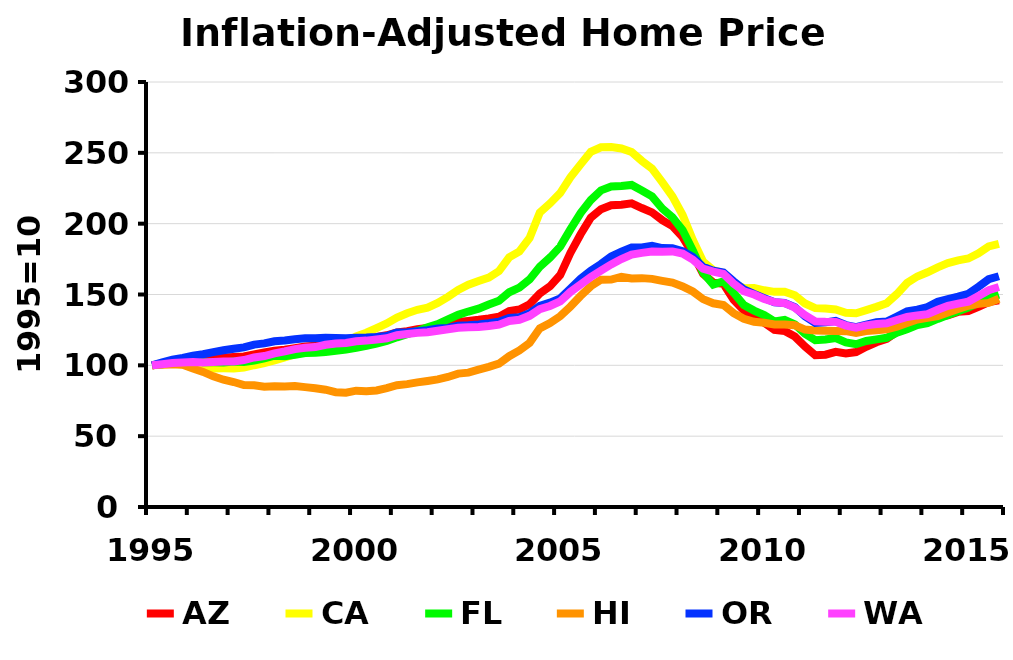
| Category | AZ | CA | FL | HI | OR | WA |
|---|---|---|---|---|---|---|
| 1995.0 | 100 | 100 | 100 | 100 | 100 | 100 |
| 1995.0 | 101.342 | 100.484 | 100.801 | 100.586 | 102.035 | 100.753 |
| 1995.0 | 102.774 | 101.14 | 102.287 | 100.735 | 104.061 | 101.647 |
| 1995.0 | 103.462 | 100.509 | 102.594 | 100.382 | 105.261 | 101.917 |
| 1996.0 | 104.591 | 99.964 | 103.133 | 97.746 | 106.752 | 102.33 |
| 1996.0 | 104.351 | 98.319 | 102.182 | 95.379 | 107.859 | 102.015 |
| 1996.0 | 105.069 | 97.852 | 102.118 | 92.247 | 109.298 | 102.302 |
| 1996.0 | 105.575 | 97.872 | 102.088 | 89.863 | 110.601 | 102.624 |
| 1997.0 | 105.873 | 97.774 | 102.773 | 88.228 | 111.661 | 102.72 |
| 1997.0 | 106.309 | 98.473 | 102.392 | 86.027 | 112.657 | 103.723 |
| 1997.0 | 107.769 | 100.085 | 103.425 | 85.91 | 114.612 | 105.556 |
| 1997.0 | 109.027 | 101.497 | 104.864 | 84.834 | 115.466 | 106.545 |
| 1998.0 | 110.241 | 103.502 | 106.788 | 85.201 | 116.987 | 108.415 |
| 1998.0 | 111.101 | 105.522 | 106.461 | 85.008 | 117.577 | 109.817 |
| 1998.0 | 112.168 | 107.878 | 107.386 | 85.377 | 118.362 | 111.436 |
| 1998.0 | 113.227 | 109.602 | 108.688 | 84.611 | 119.114 | 112.386 |
| 1999.0 | 113.869 | 110.745 | 108.852 | 83.807 | 119.097 | 112.902 |
| 1999.0 | 114.939 | 112.272 | 109.318 | 82.79 | 119.394 | 114.506 |
| 1999.0 | 116.211 | 114.435 | 110.22 | 81.068 | 119.315 | 115.398 |
| 1999.0 | 116.787 | 116.317 | 111.064 | 80.68 | 119.193 | 115.785 |
| 2000.0 | 118.5 | 120.444 | 112.387 | 82.131 | 119.509 | 116.95 |
| 2000.0 | 119.201 | 123.018 | 113.719 | 81.747 | 119.617 | 117.46 |
| 2000.0 | 120.003 | 126.318 | 115.368 | 82.263 | 119.951 | 118.302 |
| 2000.0 | 121.205 | 129.521 | 117.179 | 83.861 | 120.649 | 119.147 |
| 2001.0 | 123.16 | 133.659 | 119.775 | 85.98 | 123.139 | 121.301 |
| 2001.0 | 124.174 | 136.77 | 121.936 | 86.727 | 123.411 | 122.073 |
| 2001.0 | 125.578 | 139.203 | 124.309 | 87.956 | 124.117 | 122.907 |
| 2001.0 | 126.417 | 140.726 | 126.933 | 88.974 | 124.825 | 123.356 |
| 2002.0 | 127.761 | 144.03 | 129.084 | 90.086 | 126.015 | 124.462 |
| 2002.0 | 128.924 | 148.368 | 132.476 | 91.797 | 126.422 | 125.494 |
| 2002.0 | 130.591 | 153.25 | 135.627 | 94.176 | 128.009 | 126.494 |
| 2002.0 | 131.371 | 156.871 | 137.978 | 94.859 | 128.353 | 126.882 |
| 2003.0 | 132.135 | 159.512 | 140.027 | 96.935 | 128.884 | 127.135 |
| 2003.0 | 133.081 | 161.972 | 142.939 | 98.935 | 129.652 | 127.827 |
| 2003.0 | 134.362 | 166.503 | 145.557 | 101.209 | 130.774 | 128.687 |
| 2003.0 | 138.232 | 176.273 | 151.588 | 106.465 | 133.506 | 131.339 |
| 2004.0 | 139.43 | 180.34 | 154.821 | 110.533 | 133.973 | 132.149 |
| 2004.0 | 143.112 | 189.921 | 160.606 | 115.864 | 136.799 | 134.941 |
| 2004.0 | 150.727 | 207.881 | 169.588 | 126.125 | 141.973 | 139.702 |
| 2004.0 | 155.776 | 214.269 | 176.047 | 129.848 | 144.268 | 141.911 |
| 2005.0 | 163.728 | 221.57 | 183.802 | 134.684 | 147.295 | 145.151 |
| 2005.0 | 179.348 | 232.729 | 195.961 | 141.476 | 154.035 | 151.792 |
| 2005.0 | 192.532 | 241.866 | 207.5 | 148.985 | 161.046 | 157.022 |
| 2005.0 | 204.198 | 250.736 | 216.661 | 155.833 | 166.849 | 162.392 |
| 2006.0 | 210.251 | 253.903 | 223.531 | 160.461 | 171.504 | 166.842 |
| 2006.0 | 212.977 | 254.098 | 226.295 | 160.555 | 176.947 | 171.275 |
| 2006.0 | 213.403 | 253.083 | 226.581 | 162.411 | 180.316 | 175.055 |
| 2006.0 | 214.309 | 250.63 | 227.351 | 161.369 | 183.19 | 178.15 |
| 2007.0 | 211.026 | 244.353 | 223.442 | 161.553 | 183.179 | 179.405 |
| 2007.0 | 207.939 | 238.85 | 219.3 | 161.033 | 184.289 | 180.33 |
| 2007.0 | 202.537 | 229.356 | 210.675 | 159.655 | 182.738 | 180.179 |
| 2007.0 | 198.259 | 219.278 | 204.56 | 158.407 | 182.657 | 180.409 |
| 2008.0 | 190.498 | 206.07 | 195.341 | 155.725 | 180.523 | 178.945 |
| 2008.0 | 178.609 | 188.537 | 181.104 | 152.102 | 176.42 | 174.61 |
| 2008.0 | 164.626 | 173.33 | 165.448 | 146.75 | 169.513 | 168.198 |
| 2008.0 | 158.378 | 167.205 | 156.982 | 143.819 | 166.849 | 166.188 |
| 2009.0 | 157.541 | 165.182 | 159.347 | 142.61 | 165.458 | 164.58 |
| 2009.0 | 146.363 | 157.916 | 151.225 | 136.823 | 159.276 | 157.696 |
| 2009.0 | 138.712 | 154.49 | 142.492 | 132.878 | 153.667 | 152.345 |
| 2009.0 | 134.196 | 154.548 | 138.623 | 130.714 | 150.431 | 149.979 |
| 2010.0 | 130.115 | 152.966 | 135.413 | 130.101 | 147.412 | 146.811 |
| 2010.0 | 124.961 | 151.876 | 131.003 | 128.809 | 144.53 | 144.581 |
| 2010.0 | 124.293 | 151.945 | 132.028 | 128.808 | 143.969 | 143.892 |
| 2010.0 | 120.279 | 149.489 | 128.891 | 128.297 | 141.094 | 140.7 |
| 2011.0 | 113.296 | 143.647 | 122.266 | 125.247 | 134.53 | 135.324 |
| 2011.0 | 107.153 | 140.392 | 117.757 | 124.583 | 129.96 | 131.033 |
| 2011.0 | 107.525 | 140.061 | 118.285 | 124.477 | 130.332 | 130.761 |
| 2011.0 | 109.474 | 139.388 | 119.316 | 124.262 | 131.312 | 130.682 |
| 2012.0 | 108.371 | 137.086 | 116.228 | 124.108 | 128.42 | 128.044 |
| 2012.0 | 109.389 | 136.793 | 114.911 | 122.819 | 126.926 | 126.579 |
| 2012.0 | 113.143 | 138.965 | 117.175 | 124.144 | 128.762 | 128.238 |
| 2012.0 | 116.247 | 141.267 | 118.336 | 124.755 | 130.447 | 129.23 |
| 2013.0 | 118.595 | 143.884 | 119.431 | 125.372 | 130.893 | 129.686 |
| 2013.0 | 123.736 | 150.295 | 123.114 | 127.243 | 134.396 | 131.993 |
| 2013.0 | 127.612 | 158.148 | 125.535 | 129.84 | 138.077 | 134.163 |
| 2013.0 | 130.545 | 162.746 | 128.366 | 132.292 | 139.29 | 135.242 |
| 2014.0 | 133.006 | 165.701 | 129.808 | 133.527 | 141.084 | 136.081 |
| 2014.0 | 134.503 | 169.188 | 132.772 | 134.705 | 144.878 | 139.209 |
| 2014.0 | 135.272 | 172.127 | 135.49 | 137.264 | 146.743 | 142.049 |
| 2014.0 | 137.735 | 174.071 | 138.129 | 139.78 | 148.429 | 143.517 |
| 2015.0 | 138.354 | 175.427 | 140.727 | 142.102 | 150.448 | 144.998 |
| 2015.0 | 141.238 | 179.027 | 144.187 | 143.37 | 155.444 | 149.004 |
| 2015.0 | 144.624 | 183.951 | 147.516 | 144.098 | 160.786 | 153.053 |
| 2015.0 | 145.978 | 185.794 | 149.863 | 147.046 | 162.904 | 155.286 |